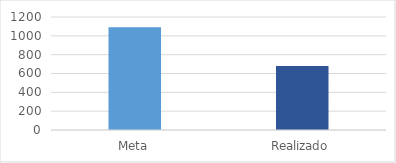
| Category | Series 0 |
|---|---|
| Meta | 1090 |
| Realizado | 680 |